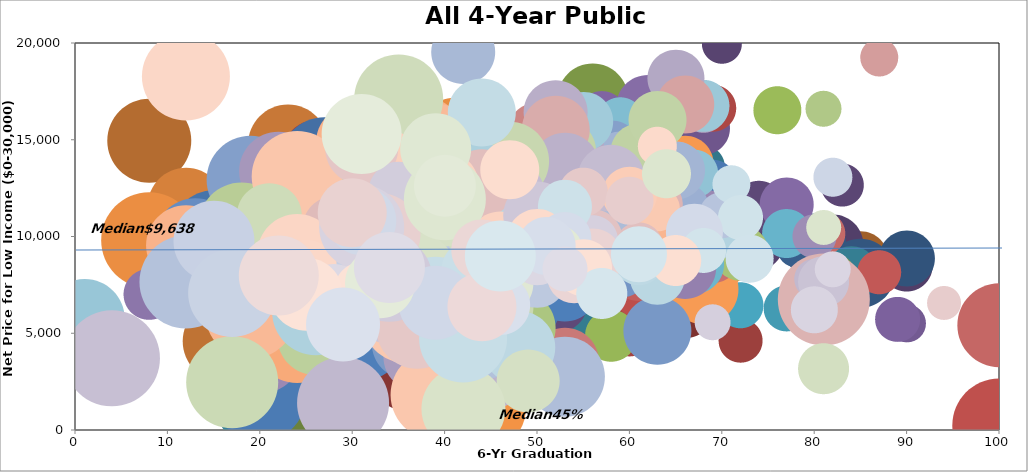
| Category | Series 0 |
|---|---|
| 31.0 | 7916 |
| 25.0 | 6204 |
| 26.0 | 8443 |
| 66.0 | 13191 |
| 66.0 | 17206 |
| 45.0 | 14652 |
| 45.0 | 12361 |
| 43.0 | 12723 |
| 39.0 | 10165 |
| 33.0 | 9044 |
| 32.0 | 14021 |
| 35.0 | 11192 |
| 33.0 | 11270 |
| 28.0 | 12131 |
| 26.0 | 12342 |
| 32.0 | 12683 |
| 59.0 | 8801 |
| 40.0 | 8003 |
| 38.0 | 7990 |
| 21.0 | 9026 |
| 43.0 | 8433 |
| 31.0 | 7969 |
| 34.0 | 6792 |
| 23.0 | 6429 |
| 23.0 | 9686 |
| 23.0 | 7140 |
| 58.0 | 8246 |
| 61.0 | 10542 |
| 49.0 | 8701 |
| 52.0 | 11962 |
| 51.0 | 6489 |
| 75.0 | 9938 |
| 62.0 | 11371 |
| 90.0 | 8506 |
| 57.0 | 10818 |
| 85.0 | 8861 |
| 90.0 | 8883 |
| 66.0 | 6298 |
| 59.0 | 9956 |
| 82.0 | 9573 |
| 46.0 | 9571 |
| 50.0 | 4449 |
| 80.0 | 9546 |
| 50.0 | 7599 |
| 54.0 | 10665 |
| 49.0 | 8427 |
| 40.0 | 10579 |
| 46.0 | 9900 |
| 85.0 | 8096 |
| 54.0 | 6048 |
| 38.0 | 5334 |
| 73.0 | 9989 |
| 43.0 | 8800 |
| 42.0 | 6971 |
| 67.0 | 7651 |
| 46.0 | 8779 |
| 49.0 | 4711 |
| 49.0 | 4281 |
| 58.0 | 8670 |
| 41.0 | 6299 |
| 45.0 | 4967 |
| 36.0 | 3207 |
| 24.0 | 1592 |
| 70.0 | 19966 |
| 68.0 | 13636 |
| 64.0 | 9898 |
| 41.0 | 9399 |
| 37.0 | 10617 |
| 39.0 | 11174 |
| 46.0 | 14208 |
| 40.0 | 9870 |
| 21.0 | 8618 |
| 25.0 | 13340 |
| 32.0 | 11016 |
| 23.0 | 14705 |
| 83.0 | 12678 |
| 48.0 | 5585 |
| 49.0 | 14399 |
| 40.0 | 12778 |
| 44.0 | 11967 |
| 47.0 | 12522 |
| 51.0 | 5323 |
| 57.0 | 5621 |
| 8.0 | 14969 |
| 78.0 | 9409 |
| 35.0 | 12481 |
| 68.0 | 7007 |
| 74.0 | 11542 |
| 84.0 | 8111 |
| 63.0 | 11134 |
| 50.0 | 6825 |
| 45.0 | 10778 |
| 43.0 | 10215 |
| 52.0 | 6688 |
| 30.0 | 8709 |
| 48.0 | 9379 |
| 43.0 | 9183 |
| 40.0 | 10326 |
| 79.0 | 7364 |
| 55.0 | 12590 |
| 82.0 | 8004 |
| 28.0 | 14418 |
| 47.0 | 13532 |
| 41.0 | 13046 |
| 34.0 | 8407 |
| 32.0 | 12451 |
| 19.0 | 1135 |
| 43.0 | 13421 |
| 30.0 | 9462 |
| 39.0 | 11209 |
| 31.0 | 9645 |
| 47.0 | 13435 |
| 15.0 | 7817 |
| 16.0 | 4611 |
| 27.0 | 10669 |
| 30.0 | 8997 |
| 41.0 | 12026 |
| 33.0 | 13336 |
| 23.0 | 9726 |
| 55.0 | 7363 |
| 37.0 | 7544 |
| 71.0 | 11351 |
| 68.0 | 8653 |
| 67.0 | 9891 |
| 29.0 | 11769 |
| 51.0 | 10173 |
| 26.0 | 13197 |
| 28.0 | 10218 |
| 82.0 | 7954 |
| 71.0 | 11205 |
| 52.0 | 12357 |
| 59.0 | 13281 |
| 61.0 | 7173 |
| 53.0 | 14583 |
| 56.0 | 17122 |
| 44.0 | 12591 |
| 54.0 | 9618 |
| 23.0 | 14784 |
| 21.0 | 10087 |
| 72.0 | 4632 |
| 68.0 | 7228 |
| 55.0 | 9178 |
| 34.0 | 9434 |
| 33.0 | 9684 |
| 20.0 | 7144 |
| 26.0 | 14323 |
| 23.0 | 10220 |
| 28.0 | 8924 |
| 27.0 | 8102 |
| 17.0 | 6396 |
| 22.0 | 8129 |
| 42.0 | 8220 |
| 19.0 | 5045 |
| 61.0 | 13943 |
| 56.0 | 13078 |
| 49.0 | 9279 |
| 43.0 | 13336 |
| 43.0 | 10007 |
| 37.0 | 8904 |
| 40.0 | 8488 |
| 59.0 | 9743 |
| 51.0 | 9908 |
| 52.0 | 7381 |
| 37.0 | 4689 |
| 50.0 | 10350 |
| 38.0 | 8119 |
| 40.0 | 8774 |
| 21.0 | 10939 |
| 31.0 | 14078 |
| 60.0 | 5049 |
| 49.0 | 7027 |
| 28.0 | 6097 |
| 41.0 | 6525 |
| 37.0 | 6453 |
| 33.0 | 7318 |
| 38.0 | 7770 |
| 38.0 | 7222 |
| 37.0 | 6605 |
| 33.0 | 6404 |
| 12.0 | 11579 |
| 27.0 | 13814 |
| 65.0 | 7115 |
| 67.0 | 12116 |
| 68.0 | 15601 |
| 52.0 | 14019 |
| 52.0 | 12054 |
| 50.0 | 9978 |
| 58.0 | 11609 |
| 47.0 | 10397 |
| 47.0 | 8845 |
| 42.0 | 11182 |
| 48.0 | 11896 |
| 40.0 | 7634 |
| 53.0 | 11550 |
| 79.0 | 7806 |
| 82.0 | 7901 |
| 67.0 | 11363 |
| 57.0 | 13285 |
| 64.0 | 9455 |
| 45.0 | 13962 |
| 41.0 | 8581 |
| 31.0 | 10682 |
| 28.0 | 11741 |
| 10.0 | 9358 |
| 15.0 | 10206 |
| 69.0 | 16638 |
| 60.0 | 12921 |
| 33.0 | 14414 |
| 59.0 | 11305 |
| 33.0 | 10963 |
| 30.0 | 8506 |
| 38.0 | 7107 |
| 16.0 | 9046 |
| 90.0 | 5529 |
| 77.0 | 6293 |
| 65.0 | 9204 |
| 40.0 | 7311 |
| 63.0 | 11159 |
| 54.0 | 10107 |
| 56.0 | 13575 |
| 37.0 | 7952 |
| 39.0 | 11596 |
| 49.0 | 6386 |
| 48.0 | 8984 |
| 35.0 | 7064 |
| 45.0 | 9469 |
| 40.0 | 10938 |
| 26.0 | 10544 |
| 70.0 | 9535 |
| 55.0 | 8731 |
| 54.0 | 12048 |
| 45.0 | 10247 |
| 50.0 | 9569 |
| 60.0 | 8312 |
| 42.0 | 9739 |
| 48.0 | 10547 |
| 39.0 | 11075 |
| 46.0 | 7918 |
| 29.0 | 11410 |
| 70.0 | 8600 |
| 69.0 | 12731 |
| 67.0 | 11127 |
| 55.0 | 11559 |
| 49.0 | 7263 |
| 46.0 | 9220 |
| 41.0 | 15522 |
| 50.0 | 11830 |
| 51.0 | 9757 |
| 27.0 | 8422 |
| 33.0 | 7949 |
| 20.0 | 8865 |
| 8.0 | 9819 |
| 20.0 | 1796 |
| 60.0 | 10647 |
| 60.0 | 14153 |
| 47.0 | 11555 |
| 32.0 | 12639 |
| 39.0 | 8970 |
| 33.0 | 13419 |
| 40.0 | 12846 |
| 24.0 | 10105 |
| 51.0 | 13215 |
| 41.0 | 9150 |
| 47.0 | 11134 |
| 33.0 | 10982 |
| 31.0 | 8530 |
| 19.0 | 12843 |
| 89.0 | 5729 |
| 72.0 | 6456 |
| 67.0 | 7958 |
| 65.0 | 6845 |
| 61.0 | 7134 |
| 58.0 | 4878 |
| 59.0 | 8583 |
| 53.0 | 8375 |
| 50.0 | 8558 |
| 53.0 | 7392 |
| 34.0 | 8153 |
| 41.0 | 6743 |
| 41.0 | 7065 |
| 38.0 | 8699 |
| 44.0 | 1144 |
| 31.0 | 4826 |
| 54.0 | 10296 |
| 54.0 | 13479 |
| 34.0 | 8068 |
| 31.0 | 8757 |
| 25.0 | 8954 |
| 42.0 | 8654 |
| 100.0 | 252 |
| 67.0 | 11123 |
| 61.0 | 11685 |
| 43.0 | 9311 |
| 46.0 | 8047 |
| 51.0 | 8524 |
| 26.0 | 10158 |
| 76.0 | 16532 |
| 57.0 | 16203 |
| 55.0 | 14014 |
| 59.0 | 15211 |
| 45.0 | 14194 |
| 87.0 | 8167 |
| 71.0 | 9199 |
| 77.0 | 11659 |
| 72.0 | 20837 |
| 66.0 | 13754 |
| 54.0 | 11384 |
| 61.0 | 8296 |
| 46.0 | 10976 |
| 62.0 | 16701 |
| 49.0 | 9979 |
| 68.0 | 7286 |
| 39.0 | 8561 |
| 46.0 | 7612 |
| 44.0 | 7100 |
| 46.0 | 8397 |
| 24.0 | 7506 |
| 21.0 | 8809 |
| 13.0 | 9869 |
| 100.0 | 5434 |
| 30.0 | 9593 |
| 8.0 | 7017 |
| 51.0 | 12465 |
| 40.0 | 9197 |
| 22.0 | 9252 |
| 81.0 | 10168 |
| 47.0 | 10707 |
| 66.0 | 10367 |
| 77.0 | 10159 |
| 67.0 | 10428 |
| 67.0 | 9046 |
| 69.0 | 9002 |
| 72.0 | 9181 |
| 40.0 | 4857 |
| 67.0 | 8585 |
| 56.0 | 11661 |
| 59.0 | 8392 |
| 63.0 | 10078 |
| 64.0 | 10032 |
| 66.0 | 8389 |
| 57.0 | 9951 |
| 47.0 | 7570 |
| 63.0 | 5148 |
| 53.0 | 3538 |
| 51.0 | 9222 |
| 47.0 | 6976 |
| 46.0 | 4698 |
| 48.0 | 3923 |
| 36.0 | 4495 |
| 35.0 | 11459 |
| 48.0 | 5274 |
| 68.0 | 10520 |
| 54.0 | 10592 |
| 40.0 | 3537 |
| 39.0 | 3470 |
| 31.0 | 12715 |
| 32.0 | 9140 |
| 20.0 | 4087 |
| 40.0 | 2668 |
| 24.0 | 4716 |
| 19.0 | 12936 |
| 39.0 | 7186 |
| 81.0 | 16604 |
| 80.0 | 10026 |
| 59.0 | 15961 |
| 65.0 | 13628 |
| 58.0 | 14447 |
| 50.0 | 15368 |
| 37.0 | 8661 |
| 39.0 | 12374 |
| 40.0 | 13089 |
| 38.0 | 12405 |
| 30.0 | 7047 |
| 28.0 | 7716 |
| 29.0 | 7978 |
| 46.0 | 12687 |
| 24.0 | 7275 |
| 38.0 | 15408 |
| 45.0 | 9865 |
| 28.0 | 6842 |
| 27.0 | 11670 |
| 23.0 | 12704 |
| 23.0 | 7807 |
| 30.0 | 14876 |
| 35.0 | 10641 |
| 19.0 | 9207 |
| 17.0 | 8340 |
| 22.0 | 13391 |
| 25.0 | 9298 |
| 12.0 | 9554 |
| 22.0 | 9651 |
| 15.0 | 8586 |
| 18.0 | 10584 |
| 24.0 | 10702 |
| 67.0 | 13252 |
| 62.0 | 9677 |
| 39.0 | 5027 |
| 36.0 | 8572 |
| 33.0 | 7742 |
| 37.0 | 3763 |
| 34.0 | 7329 |
| 30.0 | 9789 |
| 23.0 | 10885 |
| 19.0 | 7965 |
| 26.0 | 4811 |
| 29.0 | 6498 |
| 1.0 | 5763 |
| 19.0 | 6038 |
| 66.0 | 11496 |
| 61.0 | 13854 |
| 38.0 | 11306 |
| 42.0 | 10722 |
| 33.0 | 10779 |
| 39.0 | 15105 |
| 32.0 | 11709 |
| 87.0 | 19268 |
| 79.0 | 20132 |
| 68.0 | 16581 |
| 68.0 | 16759 |
| 59.0 | 12036 |
| 59.0 | 14018 |
| 60.0 | 12369 |
| 61.0 | 14382 |
| 65.0 | 18193 |
| 40.0 | 10513 |
| 59.0 | 12489 |
| 65.0 | 13434 |
| 66.0 | 16838 |
| 63.0 | 16046 |
| 54.0 | 14850 |
| 55.0 | 15966 |
| 47.0 | 10214 |
| 52.0 | 13471 |
| 45.0 | 11360 |
| 53.0 | 14454 |
| 37.0 | 9539 |
| 52.0 | 14707 |
| 46.0 | 10624 |
| 42.0 | 19539 |
| 47.0 | 12691 |
| 47.0 | 9559 |
| 52.0 | 16423 |
| 48.0 | 13450 |
| 49.0 | 12933 |
| 60.0 | 11609 |
| 52.0 | 15531 |
| 53.0 | 12161 |
| 53.0 | 13597 |
| 44.0 | 9633 |
| 42.0 | 10125 |
| 47.0 | 13846 |
| 46.0 | 11295 |
| 47.0 | 13899 |
| 40.0 | 13141 |
| 44.0 | 12670 |
| 24.0 | 13125 |
| 53.0 | 2757 |
| 42.0 | 8192 |
| 45.0 | 6441 |
| 45.0 | 3338 |
| 26.0 | 6133 |
| 39.0 | 1828 |
| 44.0 | 4986 |
| 81.0 | 6766 |
| 17.0 | 2476 |
| 29.0 | 1403 |
| 38.0 | 7146 |
| 36.0 | 5850 |
| 12.0 | 7657 |
| 63.0 | 11660 |
| 44.0 | 6016 |
| 80.0 | 7815 |
| 70.0 | 10048 |
| 63.0 | 11439 |
| 70.0 | 11114 |
| 46.0 | 12197 |
| 21.0 | 11086 |
| 58.0 | 13018 |
| 41.0 | 8893 |
| 39.0 | 10656 |
| 37.0 | 11285 |
| 42.0 | 10478 |
| 35.0 | 17125 |
| 48.0 | 12403 |
| 47.0 | 12172 |
| 60.0 | 12199 |
| 42.0 | 11371 |
| 28.0 | 10478 |
| 34.0 | 10734 |
| 4.0 | 3704 |
| 63.0 | 7908 |
| 39.0 | 6654 |
| 50.0 | 7873 |
| 44.0 | 12766 |
| 38.0 | 9352 |
| 45.0 | 6233 |
| 48.0 | 4279 |
| 34.0 | 13508 |
| 36.0 | 8719 |
| 61.0 | 9468 |
| 81.0 | 3174 |
| 81.0 | 7667 |
| 61.0 | 8801 |
| 34.0 | 5866 |
| 40.0 | 7113 |
| 56.0 | 9859 |
| 49.0 | 2551 |
| 34.0 | 6078 |
| 39.0 | 12247 |
| 46.0 | 9643 |
| 42.0 | 7426 |
| 27.0 | 8242 |
| 40.0 | 11240 |
| 50.0 | 11096 |
| 44.0 | 16427 |
| 40.0 | 12645 |
| 30.0 | 9452 |
| 31.0 | 14576 |
| 37.0 | 8229 |
| 33.0 | 8244 |
| 39.0 | 6975 |
| 24.0 | 9121 |
| 15.0 | 9772 |
| 37.0 | 5303 |
| 42.0 | 1117 |
| 34.0 | 7829 |
| 42.0 | 4728 |
| 12.0 | 18277 |
| 17.0 | 7078 |
| 55.0 | 12299 |
| 52.0 | 9895 |
| 35.0 | 12314 |
| 43.0 | 8248 |
| 25.0 | 8211 |
| 91.0 | 20724 |
| 94.0 | 6591 |
| 81.0 | 10480 |
| 69.0 | 5571 |
| 71.0 | 12720 |
| 63.0 | 14675 |
| 82.0 | 13075 |
| 60.0 | 11853 |
| 64.0 | 13249 |
| 56.0 | 9789 |
| 53.0 | 11544 |
| 50.0 | 9852 |
| 39.0 | 6583 |
| 33.0 | 10139 |
| 40.0 | 11936 |
| 31.0 | 10486 |
| 72.0 | 10994 |
| 47.0 | 13473 |
| 31.0 | 10833 |
| 30.0 | 11231 |
| 39.0 | 14557 |
| 80.0 | 6220 |
| 73.0 | 8859 |
| 54.0 | 8687 |
| 67.0 | 10232 |
| 56.0 | 8866 |
| 46.0 | 7605 |
| 82.0 | 8306 |
| 68.0 | 9291 |
| 65.0 | 8765 |
| 53.0 | 9910 |
| 54.0 | 7952 |
| 52.0 | 9213 |
| 50.0 | 8942 |
| 61.0 | 9095 |
| 55.0 | 8404 |
| 51.0 | 9529 |
| 44.0 | 9319 |
| 40.0 | 12644 |
| 28.0 | 6898 |
| 57.0 | 7062 |
| 31.0 | 7282 |
| 46.0 | 6462 |
| 44.0 | 6395 |
| 33.0 | 7598 |
| 34.0 | 8413 |
| 46.0 | 9004 |
| 25.0 | 7032 |
| 29.0 | 5462 |
| 22.0 | 8005 |
| 31.0 | 15307 |
| 53.0 | 8336 |